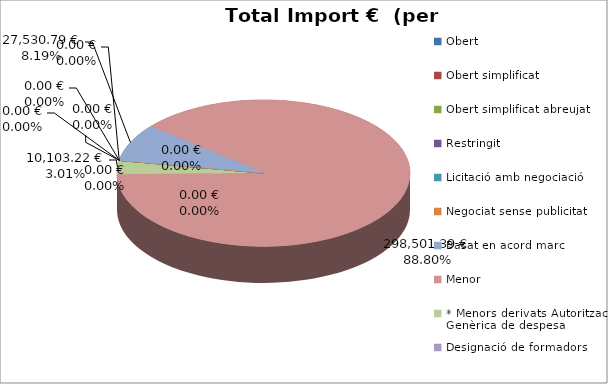
| Category | Total preu              (amb iva) |
|---|---|
| Obert | 0 |
| Obert simplificat | 0 |
| Obert simplificat abreujat | 0 |
| Restringit | 0 |
| Licitació amb negociació | 0 |
| Negociat sense publicitat | 0 |
| Basat en acord marc | 27530.79 |
| Menor | 298501.39 |
| * Menors derivats Autorització Genèrica de despesa | 10103.22 |
| Designació de formadors | 0 |